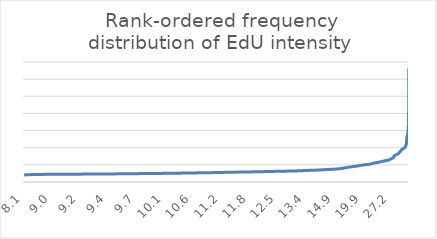
| Category | Series 0 |
|---|---|
| 8.129813264649066 | 8.13 |
| 8.166548042704626 | 8.167 |
| 8.24096025500548 | 8.241 |
| 8.310078627591137 | 8.31 |
| 8.366349866349866 | 8.366 |
| 8.379985111134744 | 8.38 |
| 8.411669367909239 | 8.412 |
| 8.428147100424328 | 8.428 |
| 8.444221260815821 | 8.444 |
| 8.449436536180308 | 8.449 |
| 8.456498129600579 | 8.456 |
| 8.457834495461123 | 8.458 |
| 8.459143968871595 | 8.459 |
| 8.466996699669966 | 8.467 |
| 8.485028790786949 | 8.485 |
| 8.516628134447803 | 8.517 |
| 8.532290279627164 | 8.532 |
| 8.53605959740054 | 8.536 |
| 8.538461538461538 | 8.538 |
| 8.541028604449581 | 8.541 |
| 8.546716003700277 | 8.547 |
| 8.552356020942408 | 8.552 |
| 8.554567022538553 | 8.555 |
| 8.574025974025973 | 8.574 |
| 8.605046343975284 | 8.605 |
| 8.609318377911993 | 8.609 |
| 8.622008032128514 | 8.622 |
| 8.622486390401066 | 8.622 |
| 8.638249224236485 | 8.638 |
| 8.64564237999068 | 8.646 |
| 8.65102207686018 | 8.651 |
| 8.65966921119593 | 8.66 |
| 8.660239866403522 | 8.66 |
| 8.665333983422721 | 8.665 |
| 8.67936657259329 | 8.679 |
| 8.69689886239676 | 8.697 |
| 8.705189430117796 | 8.705 |
| 8.70823872851119 | 8.708 |
| 8.717571059431524 | 8.718 |
| 8.728614249481208 | 8.729 |
| 8.729159500057333 | 8.729 |
| 8.737195221731303 | 8.737 |
| 8.739153162571876 | 8.739 |
| 8.745560561887093 | 8.746 |
| 8.746480434541626 | 8.746 |
| 8.758501594048884 | 8.759 |
| 8.770385710587627 | 8.77 |
| 8.77659574468085 | 8.777 |
| 8.781762168823168 | 8.782 |
| 8.790815370196814 | 8.791 |
| 8.793416884726621 | 8.793 |
| 8.803189257238774 | 8.803 |
| 8.810875576036866 | 8.811 |
| 8.811036789297658 | 8.811 |
| 8.822740231427135 | 8.823 |
| 8.833499005964216 | 8.833 |
| 8.83544833356575 | 8.835 |
| 8.838607927662707 | 8.839 |
| 8.838633871220429 | 8.839 |
| 8.85083821450212 | 8.851 |
| 8.852876911871814 | 8.853 |
| 8.85360962566845 | 8.854 |
| 8.85738743365862 | 8.857 |
| 8.86023113528212 | 8.86 |
| 8.86160312218553 | 8.862 |
| 8.87111334002006 | 8.871 |
| 8.881852230166837 | 8.882 |
| 8.883631499749205 | 8.884 |
| 8.88950276243094 | 8.89 |
| 8.891536132683955 | 8.892 |
| 8.893480257116622 | 8.893 |
| 8.895625 | 8.896 |
| 8.897562066651755 | 8.898 |
| 8.897903372835005 | 8.898 |
| 8.898186173853524 | 8.898 |
| 8.90245985650837 | 8.902 |
| 8.90302432610125 | 8.903 |
| 8.907347379794706 | 8.907 |
| 8.91202823784958 | 8.912 |
| 8.912136294027565 | 8.912 |
| 8.91364639142767 | 8.914 |
| 8.914715968391233 | 8.915 |
| 8.915706175812833 | 8.916 |
| 8.916296625222024 | 8.916 |
| 8.926121853338199 | 8.926 |
| 8.928296296296296 | 8.928 |
| 8.930947897049592 | 8.931 |
| 8.933562992125983 | 8.934 |
| 8.934878587196469 | 8.935 |
| 8.938129942626764 | 8.938 |
| 8.939492074313959 | 8.939 |
| 8.945547445255475 | 8.946 |
| 8.947769817425469 | 8.948 |
| 8.949609035621199 | 8.95 |
| 8.9506854531607 | 8.951 |
| 8.950883449505593 | 8.951 |
| 8.95171875 | 8.952 |
| 8.952815829528157 | 8.953 |
| 8.957718120805369 | 8.958 |
| 8.961833003952568 | 8.962 |
| 8.961864406779661 | 8.962 |
| 8.96410624551328 | 8.964 |
| 8.96595481275147 | 8.966 |
| 8.973562152133582 | 8.974 |
| 8.973927542822494 | 8.974 |
| 8.975416336241079 | 8.975 |
| 8.977755136695533 | 8.978 |
| 8.983205288547436 | 8.983 |
| 8.984319963640495 | 8.984 |
| 8.984738438907787 | 8.985 |
| 8.985842985842986 | 8.986 |
| 8.988038602691315 | 8.988 |
| 8.995953382971836 | 8.996 |
| 8.997592536864278 | 8.998 |
| 8.999272409778813 | 8.999 |
| 9.0 | 9 |
| 9.002621919244888 | 9.003 |
| 9.003443276549474 | 9.003 |
| 9.005114735969036 | 9.005 |
| 9.005430022771064 | 9.005 |
| 9.005480371323118 | 9.005 |
| 9.00611971696309 | 9.006 |
| 9.006280903380997 | 9.006 |
| 9.008108108108107 | 9.008 |
| 9.011228945726762 | 9.011 |
| 9.01596458277435 | 9.016 |
| 9.016216216216216 | 9.016 |
| 9.016454352441613 | 9.016 |
| 9.016587373023016 | 9.017 |
| 9.020104438642297 | 9.02 |
| 9.02998279675596 | 9.03 |
| 9.03375703271515 | 9.034 |
| 9.033913170589095 | 9.034 |
| 9.035043804755945 | 9.035 |
| 9.039358359517117 | 9.039 |
| 9.040196767392832 | 9.04 |
| 9.042739652150464 | 9.043 |
| 9.04526032600095 | 9.045 |
| 9.048567747051244 | 9.049 |
| 9.04915912031048 | 9.049 |
| 9.054108894149476 | 9.054 |
| 9.054842161583734 | 9.055 |
| 9.0635327927743 | 9.064 |
| 9.066113686264943 | 9.066 |
| 9.067302219692658 | 9.067 |
| 9.069659953780125 | 9.07 |
| 9.070823710546573 | 9.071 |
| 9.071221131240492 | 9.071 |
| 9.072883573163894 | 9.073 |
| 9.073660960795142 | 9.074 |
| 9.074028629856851 | 9.074 |
| 9.07514450867052 | 9.075 |
| 9.075195433676635 | 9.075 |
| 9.075357710651828 | 9.075 |
| 9.077960284383428 | 9.078 |
| 9.079102874026322 | 9.079 |
| 9.084044437288682 | 9.084 |
| 9.084459972656843 | 9.084 |
| 9.087212563095905 | 9.087 |
| 9.090793448878996 | 9.091 |
| 9.092301491334139 | 9.092 |
| 9.093959731543624 | 9.094 |
| 9.095511621693829 | 9.096 |
| 9.101149425287357 | 9.101 |
| 9.101897284919856 | 9.102 |
| 9.104249909189974 | 9.104 |
| 9.10529072812991 | 9.105 |
| 9.105847520355292 | 9.106 |
| 9.107936507936508 | 9.108 |
| 9.111025443330764 | 9.111 |
| 9.112668390257177 | 9.113 |
| 9.114404703576678 | 9.114 |
| 9.116996145716772 | 9.117 |
| 9.117428741092636 | 9.117 |
| 9.121766928218541 | 9.122 |
| 9.12647619047619 | 9.126 |
| 9.127337945170382 | 9.127 |
| 9.133295838020247 | 9.133 |
| 9.134433629566935 | 9.134 |
| 9.136840481332921 | 9.137 |
| 9.138026113048415 | 9.138 |
| 9.13826146475017 | 9.138 |
| 9.138374717832956 | 9.138 |
| 9.143751957406828 | 9.144 |
| 9.144792815503388 | 9.145 |
| 9.144966204197795 | 9.145 |
| 9.14546965918537 | 9.145 |
| 9.146328220442514 | 9.146 |
| 9.148375768217734 | 9.148 |
| 9.149300857013984 | 9.149 |
| 9.149408500073024 | 9.149 |
| 9.150312221231044 | 9.15 |
| 9.152042160737812 | 9.152 |
| 9.15343237704918 | 9.153 |
| 9.15435096469353 | 9.154 |
| 9.154432793136321 | 9.154 |
| 9.156919673717683 | 9.157 |
| 9.157017432243288 | 9.157 |
| 9.163534513913985 | 9.164 |
| 9.166761202495746 | 9.167 |
| 9.169150221506243 | 9.169 |
| 9.174244524535625 | 9.174 |
| 9.177725118483412 | 9.178 |
| 9.179417369997278 | 9.179 |
| 9.183983431135658 | 9.184 |
| 9.186450943069735 | 9.186 |
| 9.18687676966638 | 9.187 |
| 9.192562735665064 | 9.193 |
| 9.194591611479028 | 9.195 |
| 9.194776589049717 | 9.195 |
| 9.200248928225696 | 9.2 |
| 9.200872919204222 | 9.201 |
| 9.201003497035122 | 9.201 |
| 9.201331114808653 | 9.201 |
| 9.20253164556962 | 9.203 |
| 9.2054179145113 | 9.205 |
| 9.20751916893396 | 9.208 |
| 9.216013219167793 | 9.216 |
| 9.219592831042283 | 9.22 |
| 9.222958057395143 | 9.223 |
| 9.225694444444445 | 9.226 |
| 9.228482446206115 | 9.228 |
| 9.228517666736359 | 9.229 |
| 9.232904788522452 | 9.233 |
| 9.235556381200075 | 9.236 |
| 9.237775202780997 | 9.238 |
| 9.240120436582613 | 9.24 |
| 9.24077407740774 | 9.241 |
| 9.243337195828506 | 9.243 |
| 9.245876834619459 | 9.246 |
| 9.249405548216645 | 9.249 |
| 9.25161923454367 | 9.252 |
| 9.258383407637139 | 9.258 |
| 9.258628841607566 | 9.259 |
| 9.260070790493849 | 9.26 |
| 9.260876132930514 | 9.261 |
| 9.262137617883338 | 9.262 |
| 9.26259798432251 | 9.263 |
| 9.263687699484409 | 9.264 |
| 9.264243845252052 | 9.264 |
| 9.265185421994884 | 9.265 |
| 9.266123670212766 | 9.266 |
| 9.266146770645872 | 9.266 |
| 9.270485526114259 | 9.27 |
| 9.273116031549938 | 9.273 |
| 9.276154001209434 | 9.276 |
| 9.279123911356386 | 9.279 |
| 9.282118769534463 | 9.282 |
| 9.282602118003025 | 9.283 |
| 9.284162086156206 | 9.284 |
| 9.286654135338345 | 9.287 |
| 9.291518537328594 | 9.292 |
| 9.292140575079872 | 9.292 |
| 9.29462970403107 | 9.295 |
| 9.297084580423457 | 9.297 |
| 9.297407698350353 | 9.297 |
| 9.301999205613663 | 9.302 |
| 9.30224309815951 | 9.302 |
| 9.302430751837196 | 9.302 |
| 9.305858483388283 | 9.306 |
| 9.308482896149716 | 9.308 |
| 9.310172497178785 | 9.31 |
| 9.310265077388365 | 9.31 |
| 9.310720475365189 | 9.311 |
| 9.312926391382407 | 9.313 |
| 9.318096796820202 | 9.318 |
| 9.320267068705578 | 9.32 |
| 9.321200510855684 | 9.321 |
| 9.32411067193676 | 9.324 |
| 9.324805699481866 | 9.325 |
| 9.326155545038649 | 9.326 |
| 9.326539462272333 | 9.327 |
| 9.330219187926698 | 9.33 |
| 9.333522969705589 | 9.334 |
| 9.33442862358525 | 9.334 |
| 9.340546187136248 | 9.341 |
| 9.342038035764974 | 9.342 |
| 9.345134965473948 | 9.345 |
| 9.346321800470273 | 9.346 |
| 9.347252448313384 | 9.347 |
| 9.347332850591359 | 9.347 |
| 9.348613469156764 | 9.349 |
| 9.348701955495617 | 9.349 |
| 9.350625459896984 | 9.351 |
| 9.355636473979668 | 9.356 |
| 9.356299026557036 | 9.356 |
| 9.359747204666991 | 9.36 |
| 9.363109297831222 | 9.363 |
| 9.363664741688778 | 9.364 |
| 9.366116751269036 | 9.366 |
| 9.367935752528258 | 9.368 |
| 9.372543741588157 | 9.373 |
| 9.374017222014228 | 9.374 |
| 9.374838848302536 | 9.375 |
| 9.378120940972723 | 9.378 |
| 9.378188626257899 | 9.378 |
| 9.389293296936609 | 9.389 |
| 9.392830949761644 | 9.393 |
| 9.394549361076558 | 9.395 |
| 9.396082474226803 | 9.396 |
| 9.40054262458946 | 9.401 |
| 9.404520060944641 | 9.405 |
| 9.407932011331445 | 9.408 |
| 9.409451046972269 | 9.409 |
| 9.409602784602784 | 9.41 |
| 9.411795083660401 | 9.412 |
| 9.417451708059758 | 9.417 |
| 9.417689015691868 | 9.418 |
| 9.42214964940928 | 9.422 |
| 9.424568965517242 | 9.425 |
| 9.42521887159533 | 9.425 |
| 9.426535836177475 | 9.427 |
| 9.43687099725526 | 9.437 |
| 9.441597842575426 | 9.442 |
| 9.441622691292876 | 9.442 |
| 9.442042358730996 | 9.442 |
| 9.44228356336261 | 9.442 |
| 9.449574726609963 | 9.45 |
| 9.451551914290215 | 9.452 |
| 9.467504598405887 | 9.468 |
| 9.468667979002625 | 9.469 |
| 9.47001828153565 | 9.47 |
| 9.471065356418656 | 9.471 |
| 9.472277556440902 | 9.472 |
| 9.473381507152338 | 9.473 |
| 9.474570366929866 | 9.475 |
| 9.476833685481436 | 9.477 |
| 9.479568129014623 | 9.48 |
| 9.480049109883364 | 9.48 |
| 9.4885020137716 | 9.489 |
| 9.489320007838526 | 9.489 |
| 9.489695111565322 | 9.49 |
| 9.489720925613268 | 9.49 |
| 9.50189489641233 | 9.502 |
| 9.508739650413984 | 9.509 |
| 9.511719560257209 | 9.512 |
| 9.512962962962963 | 9.513 |
| 9.517188926072407 | 9.517 |
| 9.524772497472194 | 9.525 |
| 9.524918300653594 | 9.525 |
| 9.528756398675098 | 9.529 |
| 9.530456852791879 | 9.53 |
| 9.532325338894681 | 9.532 |
| 9.534167732505024 | 9.534 |
| 9.536882267441861 | 9.537 |
| 9.540552016985139 | 9.541 |
| 9.542437102152167 | 9.542 |
| 9.542521464075914 | 9.543 |
| 9.544990176817288 | 9.545 |
| 9.546531020680453 | 9.547 |
| 9.548562300319489 | 9.549 |
| 9.549616911289577 | 9.55 |
| 9.55013039698638 | 9.55 |
| 9.55889819751206 | 9.559 |
| 9.5592 | 9.559 |
| 9.562273507533854 | 9.562 |
| 9.563716364867151 | 9.564 |
| 9.568313306631063 | 9.568 |
| 9.574105212587076 | 9.574 |
| 9.591045335331584 | 9.591 |
| 9.593191122602887 | 9.593 |
| 9.5946123521682 | 9.595 |
| 9.596833333333333 | 9.597 |
| 9.604242424242424 | 9.604 |
| 9.608348457350273 | 9.608 |
| 9.611764705882353 | 9.612 |
| 9.615876288659793 | 9.616 |
| 9.618676677616143 | 9.619 |
| 9.621877110060769 | 9.622 |
| 9.628935352078827 | 9.629 |
| 9.630619971604354 | 9.631 |
| 9.631627734519837 | 9.632 |
| 9.633740288568257 | 9.634 |
| 9.643312101910828 | 9.643 |
| 9.645459488852637 | 9.645 |
| 9.65024818633066 | 9.65 |
| 9.650421226675064 | 9.65 |
| 9.653272101033295 | 9.653 |
| 9.653675819309123 | 9.654 |
| 9.656023222060957 | 9.656 |
| 9.663365011377326 | 9.663 |
| 9.66530666845027 | 9.665 |
| 9.669206858517999 | 9.669 |
| 9.669419050427603 | 9.669 |
| 9.676804175449162 | 9.677 |
| 9.677480614021206 | 9.677 |
| 9.689069634703197 | 9.689 |
| 9.697108066971081 | 9.697 |
| 9.700319415925165 | 9.7 |
| 9.700406353897304 | 9.7 |
| 9.703338034790786 | 9.703 |
| 9.710396851426697 | 9.71 |
| 9.711867395521072 | 9.712 |
| 9.715211970074813 | 9.715 |
| 9.71584699453552 | 9.716 |
| 9.716895874263262 | 9.717 |
| 9.723561499208165 | 9.724 |
| 9.732248745628706 | 9.732 |
| 9.733291219204043 | 9.733 |
| 9.735183673469388 | 9.735 |
| 9.736507936507936 | 9.737 |
| 9.736829268292682 | 9.737 |
| 9.745309135650569 | 9.745 |
| 9.746854554604932 | 9.747 |
| 9.74827362969357 | 9.748 |
| 9.753965026433509 | 9.754 |
| 9.765575146935348 | 9.766 |
| 9.76589121887287 | 9.766 |
| 9.769949569860575 | 9.77 |
| 9.772648648648648 | 9.773 |
| 9.773772321428572 | 9.774 |
| 9.777430817271455 | 9.777 |
| 9.777570093457944 | 9.778 |
| 9.788723160137682 | 9.789 |
| 9.795962902345881 | 9.796 |
| 9.799827882960413 | 9.8 |
| 9.800762631077216 | 9.801 |
| 9.812161844271936 | 9.812 |
| 9.822685788787483 | 9.823 |
| 9.826243413443002 | 9.826 |
| 9.82836220753706 | 9.828 |
| 9.829828987945051 | 9.83 |
| 9.829894471570325 | 9.83 |
| 9.829964664310953 | 9.83 |
| 9.831172491544532 | 9.831 |
| 9.838375190258752 | 9.838 |
| 9.840905853866971 | 9.841 |
| 9.846178293341808 | 9.846 |
| 9.846300533943555 | 9.846 |
| 9.847964499324716 | 9.848 |
| 9.85006518904824 | 9.85 |
| 9.852730696798494 | 9.853 |
| 9.855372978612415 | 9.855 |
| 9.856559949780289 | 9.857 |
| 9.859822150363783 | 9.86 |
| 9.861405769802717 | 9.861 |
| 9.865581888928192 | 9.866 |
| 9.866205305651672 | 9.866 |
| 9.867099918765232 | 9.867 |
| 9.869024996345564 | 9.869 |
| 9.873450413223141 | 9.873 |
| 9.877233165368759 | 9.877 |
| 9.877946127946128 | 9.878 |
| 9.878380311918729 | 9.878 |
| 9.878562945368172 | 9.879 |
| 9.879839298758217 | 9.88 |
| 9.885803033071442 | 9.886 |
| 9.887935544626975 | 9.888 |
| 9.89237106017192 | 9.892 |
| 9.903861671469741 | 9.904 |
| 9.906614173228347 | 9.907 |
| 9.907809983896941 | 9.908 |
| 9.908300294155262 | 9.908 |
| 9.911038209185643 | 9.911 |
| 9.911246200607902 | 9.911 |
| 9.911774352246638 | 9.912 |
| 9.918669486637185 | 9.919 |
| 9.924189872163314 | 9.924 |
| 9.925690021231423 | 9.926 |
| 9.930005546311703 | 9.93 |
| 9.935530780416869 | 9.936 |
| 9.939168927602456 | 9.939 |
| 9.945148881607066 | 9.945 |
| 9.956773091577979 | 9.957 |
| 9.958744788237876 | 9.959 |
| 9.961666487705358 | 9.962 |
| 9.969537652698314 | 9.97 |
| 9.97764853461056 | 9.978 |
| 9.977826019537913 | 9.978 |
| 9.979940808944427 | 9.98 |
| 9.983585392843969 | 9.984 |
| 9.98953728264073 | 9.99 |
| 9.989729059677705 | 9.99 |
| 9.991497975708501 | 9.991 |
| 9.996378998189499 | 9.996 |
| 9.997916666666667 | 9.998 |
| 9.99946647696959 | 9.999 |
| 10.007346393588602 | 10.007 |
| 10.00835348428226 | 10.008 |
| 10.013635855594053 | 10.014 |
| 10.017462837350267 | 10.017 |
| 10.02375130981488 | 10.024 |
| 10.025593220338983 | 10.026 |
| 10.029856768206576 | 10.03 |
| 10.03476933514247 | 10.035 |
| 10.038669844020797 | 10.039 |
| 10.04137303932712 | 10.041 |
| 10.043322789162426 | 10.043 |
| 10.04772937905468 | 10.048 |
| 10.05309381237525 | 10.053 |
| 10.074551569506726 | 10.075 |
| 10.076935056844729 | 10.077 |
| 10.077174235678243 | 10.077 |
| 10.08748701973001 | 10.087 |
| 10.092386397833284 | 10.092 |
| 10.092405961674947 | 10.092 |
| 10.095147478591818 | 10.095 |
| 10.110973533508744 | 10.111 |
| 10.11111111111111 | 10.111 |
| 10.111539697846352 | 10.112 |
| 10.111798497569598 | 10.112 |
| 10.11457511181268 | 10.115 |
| 10.114949374627754 | 10.115 |
| 10.122879709957271 | 10.123 |
| 10.12528604118993 | 10.125 |
| 10.137403786145205 | 10.137 |
| 10.142188122758071 | 10.142 |
| 10.148693093301022 | 10.149 |
| 10.152166496076424 | 10.152 |
| 10.163917391869074 | 10.164 |
| 10.167696744952616 | 10.168 |
| 10.168693812797462 | 10.169 |
| 10.170228022372006 | 10.17 |
| 10.175293894577171 | 10.175 |
| 10.17909629304672 | 10.179 |
| 10.183391486392184 | 10.183 |
| 10.185685419546953 | 10.186 |
| 10.201946771808773 | 10.202 |
| 10.208390963577685 | 10.208 |
| 10.211145194274028 | 10.211 |
| 10.219809439397297 | 10.22 |
| 10.224065362713542 | 10.224 |
| 10.224270776004403 | 10.224 |
| 10.226871145190865 | 10.227 |
| 10.248396750748183 | 10.248 |
| 10.248578391551584 | 10.249 |
| 10.252049537763824 | 10.252 |
| 10.25390770375884 | 10.254 |
| 10.25420898845137 | 10.254 |
| 10.260656740770957 | 10.261 |
| 10.26898893360161 | 10.269 |
| 10.269207223752678 | 10.269 |
| 10.269348127600555 | 10.269 |
| 10.27552967165378 | 10.276 |
| 10.283709579011592 | 10.284 |
| 10.286691365061271 | 10.287 |
| 10.290101870153565 | 10.29 |
| 10.293023677764674 | 10.293 |
| 10.293819104585825 | 10.294 |
| 10.295857388838245 | 10.296 |
| 10.296053897978826 | 10.296 |
| 10.296326530612244 | 10.296 |
| 10.296487455197132 | 10.296 |
| 10.302398331595413 | 10.302 |
| 10.30329312915029 | 10.303 |
| 10.30690537084399 | 10.307 |
| 10.307737141191899 | 10.308 |
| 10.316396396396396 | 10.316 |
| 10.318437719915552 | 10.318 |
| 10.318534616578702 | 10.319 |
| 10.32606344628695 | 10.326 |
| 10.32817949314113 | 10.328 |
| 10.333258578156537 | 10.333 |
| 10.337484116899619 | 10.337 |
| 10.346452067669173 | 10.346 |
| 10.34822259445375 | 10.348 |
| 10.358203972625605 | 10.358 |
| 10.364639142767098 | 10.365 |
| 10.36923076923077 | 10.369 |
| 10.373532982598139 | 10.374 |
| 10.38216650232427 | 10.382 |
| 10.382913165266107 | 10.383 |
| 10.392980721700445 | 10.393 |
| 10.397667359003036 | 10.398 |
| 10.40019491450341 | 10.4 |
| 10.402755993726194 | 10.403 |
| 10.406634068983745 | 10.407 |
| 10.408529438283292 | 10.409 |
| 10.41062941091747 | 10.411 |
| 10.413468869123253 | 10.413 |
| 10.419656392117231 | 10.42 |
| 10.419745154727487 | 10.42 |
| 10.422066094197241 | 10.422 |
| 10.427735610373182 | 10.428 |
| 10.430176719170188 | 10.43 |
| 10.43042537851478 | 10.43 |
| 10.442817216321968 | 10.443 |
| 10.457882661422484 | 10.458 |
| 10.477155727155727 | 10.477 |
| 10.479894644424935 | 10.48 |
| 10.486517719568567 | 10.487 |
| 10.487238340066103 | 10.487 |
| 10.488027124390761 | 10.488 |
| 10.489474459001913 | 10.489 |
| 10.498901903367496 | 10.499 |
| 10.509636803874091 | 10.51 |
| 10.509711779448622 | 10.51 |
| 10.515821708063967 | 10.516 |
| 10.51825959933222 | 10.518 |
| 10.519910799617712 | 10.52 |
| 10.536699941280094 | 10.537 |
| 10.540870403083346 | 10.541 |
| 10.543561819346573 | 10.544 |
| 10.561264822134387 | 10.561 |
| 10.568909090909091 | 10.569 |
| 10.570941487021557 | 10.571 |
| 10.571003360537686 | 10.571 |
| 10.576720310765817 | 10.577 |
| 10.586291739894552 | 10.586 |
| 10.594398635200456 | 10.594 |
| 10.598557182261828 | 10.599 |
| 10.599688230709274 | 10.6 |
| 10.604140474394434 | 10.604 |
| 10.608494533221194 | 10.608 |
| 10.609152288072018 | 10.609 |
| 10.60948905109489 | 10.609 |
| 10.620674551029348 | 10.621 |
| 10.631323350870094 | 10.631 |
| 10.636032879665812 | 10.636 |
| 10.636951034830894 | 10.637 |
| 10.639126801754752 | 10.639 |
| 10.64093567251462 | 10.641 |
| 10.643370673800367 | 10.643 |
| 10.647576016607644 | 10.648 |
| 10.657178388835153 | 10.657 |
| 10.658766377152952 | 10.659 |
| 10.662840136054422 | 10.663 |
| 10.663383749560323 | 10.663 |
| 10.668723532970358 | 10.669 |
| 10.67960489705064 | 10.68 |
| 10.681813711025868 | 10.682 |
| 10.684623138089371 | 10.685 |
| 10.697141385526654 | 10.697 |
| 10.700084423807514 | 10.7 |
| 10.7015577231038 | 10.702 |
| 10.704181028023378 | 10.704 |
| 10.706192358366271 | 10.706 |
| 10.709082308420056 | 10.709 |
| 10.713730692694021 | 10.714 |
| 10.713763145861911 | 10.714 |
| 10.714285714285714 | 10.714 |
| 10.717302704705446 | 10.717 |
| 10.722995594713657 | 10.723 |
| 10.72569626904887 | 10.726 |
| 10.735527809307605 | 10.736 |
| 10.737598467106665 | 10.738 |
| 10.75482121333869 | 10.755 |
| 10.758341128780792 | 10.758 |
| 10.758752083829483 | 10.759 |
| 10.769027384324835 | 10.769 |
| 10.776010751483929 | 10.776 |
| 10.781665132184663 | 10.782 |
| 10.786506469500925 | 10.787 |
| 10.786780383795309 | 10.787 |
| 10.803071017274473 | 10.803 |
| 10.81484671029969 | 10.815 |
| 10.819385420071919 | 10.819 |
| 10.825197889182059 | 10.825 |
| 10.828816621499548 | 10.829 |
| 10.837810023669856 | 10.838 |
| 10.839458826036008 | 10.839 |
| 10.850613154960982 | 10.851 |
| 10.852430173740927 | 10.852 |
| 10.855655984661736 | 10.856 |
| 10.855833842394624 | 10.856 |
| 10.873244929797192 | 10.873 |
| 10.881022010158535 | 10.881 |
| 10.882507976140936 | 10.883 |
| 10.892305107526882 | 10.892 |
| 10.906096316229005 | 10.906 |
| 10.906703190460844 | 10.907 |
| 10.909159871041153 | 10.909 |
| 10.909306156063414 | 10.909 |
| 10.92032555150996 | 10.92 |
| 10.921223573875045 | 10.921 |
| 10.922049801515698 | 10.922 |
| 10.927391838405896 | 10.927 |
| 10.92824427480916 | 10.928 |
| 10.93621507643648 | 10.936 |
| 10.936349693251534 | 10.936 |
| 10.942335589941973 | 10.942 |
| 10.94934725848564 | 10.949 |
| 10.963765963765963 | 10.964 |
| 10.965165097015772 | 10.965 |
| 10.96570053154147 | 10.966 |
| 10.971078475538336 | 10.971 |
| 10.97338157384675 | 10.973 |
| 10.974687652117476 | 10.975 |
| 10.975864202988241 | 10.976 |
| 10.984014826827291 | 10.984 |
| 10.984222691186815 | 10.984 |
| 10.9971031985516 | 10.997 |
| 10.997507215953817 | 10.998 |
| 11.008542141230068 | 11.009 |
| 11.017396679618509 | 11.017 |
| 11.048318332543818 | 11.048 |
| 11.055055055055055 | 11.055 |
| 11.062809174036875 | 11.063 |
| 11.082827561585148 | 11.083 |
| 11.103651354534747 | 11.104 |
| 11.109432191459408 | 11.109 |
| 11.109647561409755 | 11.11 |
| 11.120291465975052 | 11.12 |
| 11.129897132851827 | 11.13 |
| 11.13229357798165 | 11.132 |
| 11.136386855099609 | 11.136 |
| 11.144604458473072 | 11.145 |
| 11.144744466334453 | 11.145 |
| 11.161682644155102 | 11.162 |
| 11.162200785994997 | 11.162 |
| 11.16305220883534 | 11.163 |
| 11.17756081416515 | 11.178 |
| 11.17795080117355 | 11.178 |
| 11.190859549170176 | 11.191 |
| 11.190953857377348 | 11.191 |
| 11.205235411743319 | 11.205 |
| 11.208762886597938 | 11.209 |
| 11.214118915035028 | 11.214 |
| 11.219042316258351 | 11.219 |
| 11.222960151802656 | 11.223 |
| 11.224316939890711 | 11.224 |
| 11.232628704359259 | 11.233 |
| 11.235147867050511 | 11.235 |
| 11.236160349059176 | 11.236 |
| 11.238248847926267 | 11.238 |
| 11.240270727580372 | 11.24 |
| 11.240743494423791 | 11.241 |
| 11.249583256158548 | 11.25 |
| 11.251958392192115 | 11.252 |
| 11.254649217750664 | 11.255 |
| 11.256267010456954 | 11.256 |
| 11.259164733178654 | 11.259 |
| 11.264674284598104 | 11.265 |
| 11.264891488379252 | 11.265 |
| 11.290001319087192 | 11.29 |
| 11.298443147067001 | 11.298 |
| 11.325251330573625 | 11.325 |
| 11.348573213913768 | 11.349 |
| 11.354115586690018 | 11.354 |
| 11.358966775115844 | 11.359 |
| 11.35946080878682 | 11.359 |
| 11.373696872493985 | 11.374 |
| 11.3801775147929 | 11.38 |
| 11.386416408668731 | 11.386 |
| 11.388896163414953 | 11.389 |
| 11.391650099403579 | 11.392 |
| 11.39380013368984 | 11.394 |
| 11.401687454145268 | 11.402 |
| 11.406215987422906 | 11.406 |
| 11.411910056832221 | 11.412 |
| 11.413460447168312 | 11.413 |
| 11.421039725355566 | 11.421 |
| 11.424720390020074 | 11.425 |
| 11.441115814609791 | 11.441 |
| 11.442481250794458 | 11.442 |
| 11.452282157676349 | 11.452 |
| 11.457281112959322 | 11.457 |
| 11.46154977209234 | 11.462 |
| 11.46593023255814 | 11.466 |
| 11.479472954230236 | 11.479 |
| 11.485376200044653 | 11.485 |
| 11.489909468125235 | 11.49 |
| 11.502918403811792 | 11.503 |
| 11.504462691895752 | 11.504 |
| 11.506257822277847 | 11.506 |
| 11.50740883906713 | 11.507 |
| 11.516760904684975 | 11.517 |
| 11.528232800154171 | 11.528 |
| 11.529664226205504 | 11.53 |
| 11.536042162529752 | 11.536 |
| 11.540663900414938 | 11.541 |
| 11.541723049165538 | 11.542 |
| 11.546952224052719 | 11.547 |
| 11.549672213817448 | 11.55 |
| 11.559921617161717 | 11.56 |
| 11.560856158171594 | 11.561 |
| 11.562011173184358 | 11.562 |
| 11.566823704438383 | 11.567 |
| 11.56813170660003 | 11.568 |
| 11.568405139833711 | 11.568 |
| 11.57462019660411 | 11.575 |
| 11.581401690755387 | 11.581 |
| 11.586712261846605 | 11.587 |
| 11.605756358768406 | 11.606 |
| 11.623615892807296 | 11.624 |
| 11.625722209382944 | 11.626 |
| 11.639897435897437 | 11.64 |
| 11.644350758853289 | 11.644 |
| 11.649072753209701 | 11.649 |
| 11.65302610192179 | 11.653 |
| 11.661697596592637 | 11.662 |
| 11.664547818549552 | 11.665 |
| 11.665197188132968 | 11.665 |
| 11.668964796824403 | 11.669 |
| 11.699083598279408 | 11.699 |
| 11.700439355611769 | 11.7 |
| 11.71557418699187 | 11.716 |
| 11.71715774917562 | 11.717 |
| 11.728670691422714 | 11.729 |
| 11.728798455369077 | 11.729 |
| 11.732288677996028 | 11.732 |
| 11.732826843937955 | 11.733 |
| 11.734957020057307 | 11.735 |
| 11.735781056425273 | 11.736 |
| 11.7425035697287 | 11.743 |
| 11.747025419145483 | 11.747 |
| 11.748947684906796 | 11.749 |
| 11.754054369385136 | 11.754 |
| 11.76080340839927 | 11.761 |
| 11.76158495634654 | 11.762 |
| 11.766516058126756 | 11.767 |
| 11.772487804878049 | 11.772 |
| 11.775092637344933 | 11.775 |
| 11.794421487603305 | 11.794 |
| 11.797289853475817 | 11.797 |
| 11.798793395427603 | 11.799 |
| 11.801600817438691 | 11.802 |
| 11.803163241745555 | 11.803 |
| 11.807880237030876 | 11.808 |
| 11.820245120290513 | 11.82 |
| 11.82343725520915 | 11.823 |
| 11.83358598618831 | 11.834 |
| 11.842247433819557 | 11.842 |
| 11.85795583883451 | 11.858 |
| 11.861761638380582 | 11.862 |
| 11.866372980910425 | 11.866 |
| 11.8719723183391 | 11.872 |
| 11.898393724318266 | 11.898 |
| 11.917422044960116 | 11.917 |
| 11.92612195390892 | 11.926 |
| 11.92841775865441 | 11.928 |
| 11.932386910490857 | 11.932 |
| 11.962884908090388 | 11.963 |
| 11.979299918595185 | 11.979 |
| 11.984516817939134 | 11.985 |
| 11.990448901623687 | 11.99 |
| 11.992000820428673 | 11.992 |
| 11.998112732762959 | 11.998 |
| 11.999137838129109 | 11.999 |
| 12.011296611016695 | 12.011 |
| 12.013800820589333 | 12.014 |
| 12.028936432199476 | 12.029 |
| 12.037859154929578 | 12.038 |
| 12.040688092295014 | 12.041 |
| 12.042569081404032 | 12.043 |
| 12.047845659163988 | 12.048 |
| 12.050682961897914 | 12.051 |
| 12.059643593162807 | 12.06 |
| 12.064458900059137 | 12.064 |
| 12.066504213625748 | 12.067 |
| 12.067961165048544 | 12.068 |
| 12.06945889698231 | 12.069 |
| 12.078757133798351 | 12.079 |
| 12.094577553593947 | 12.095 |
| 12.095567144719688 | 12.096 |
| 12.097908224728945 | 12.098 |
| 12.098446147296722 | 12.098 |
| 12.099941724941726 | 12.1 |
| 12.103866565579985 | 12.104 |
| 12.10675818373812 | 12.107 |
| 12.108792522551896 | 12.109 |
| 12.109224057338734 | 12.109 |
| 12.112628561793963 | 12.113 |
| 12.12288013797068 | 12.123 |
| 12.129849449913145 | 12.13 |
| 12.130851792646723 | 12.131 |
| 12.137264806162394 | 12.137 |
| 12.14954982450786 | 12.15 |
| 12.156912826207662 | 12.157 |
| 12.165755014089177 | 12.166 |
| 12.176235268677695 | 12.176 |
| 12.189796850034238 | 12.19 |
| 12.19119170984456 | 12.191 |
| 12.202673410404625 | 12.203 |
| 12.207046388725779 | 12.207 |
| 12.207352287872057 | 12.207 |
| 12.212889117571391 | 12.213 |
| 12.228043979910412 | 12.228 |
| 12.24042361424065 | 12.24 |
| 12.258354755784062 | 12.258 |
| 12.277682233099616 | 12.278 |
| 12.28031007751938 | 12.28 |
| 12.288595594386095 | 12.289 |
| 12.28917329643722 | 12.289 |
| 12.293124929210556 | 12.293 |
| 12.296020161713745 | 12.296 |
| 12.298811846071999 | 12.299 |
| 12.310368256556597 | 12.31 |
| 12.31520609629373 | 12.315 |
| 12.317790167257982 | 12.318 |
| 12.330810171496156 | 12.331 |
| 12.331011211494504 | 12.331 |
| 12.346009085009735 | 12.346 |
| 12.348693966008897 | 12.349 |
| 12.350948834974778 | 12.351 |
| 12.360917343526038 | 12.361 |
| 12.3764689423615 | 12.376 |
| 12.393113159242192 | 12.393 |
| 12.396814335490294 | 12.397 |
| 12.402930402930403 | 12.403 |
| 12.412197815682905 | 12.412 |
| 12.412546517809675 | 12.413 |
| 12.414831824935836 | 12.415 |
| 12.42614579343802 | 12.426 |
| 12.42726005112712 | 12.427 |
| 12.434039087947882 | 12.434 |
| 12.435146923783288 | 12.435 |
| 12.443528894748408 | 12.444 |
| 12.454867256637169 | 12.455 |
| 12.457622739018088 | 12.458 |
| 12.467897679146198 | 12.468 |
| 12.470735422106179 | 12.471 |
| 12.483462436985123 | 12.483 |
| 12.48717564121794 | 12.487 |
| 12.488031511968488 | 12.488 |
| 12.499263894000736 | 12.499 |
| 12.510450048766895 | 12.51 |
| 12.515235457063712 | 12.515 |
| 12.515927395119606 | 12.516 |
| 12.521663019693655 | 12.522 |
| 12.52180910993079 | 12.522 |
| 12.538283955367449 | 12.538 |
| 12.54444618028433 | 12.544 |
| 12.546570942754581 | 12.547 |
| 12.556037991858888 | 12.556 |
| 12.561258518196317 | 12.561 |
| 12.56586213949683 | 12.566 |
| 12.581534772182254 | 12.582 |
| 12.586397567044513 | 12.586 |
| 12.587660290098801 | 12.588 |
| 12.603562421185371 | 12.604 |
| 12.61955835962145 | 12.62 |
| 12.628796154686476 | 12.629 |
| 12.629612330686594 | 12.63 |
| 12.629818413507486 | 12.63 |
| 12.633149892733886 | 12.633 |
| 12.64756019603665 | 12.648 |
| 12.659065155807365 | 12.659 |
| 12.666258607498087 | 12.666 |
| 12.680024360535931 | 12.68 |
| 12.680350877192982 | 12.68 |
| 12.709666080843585 | 12.71 |
| 12.718402924223254 | 12.718 |
| 12.722308088614117 | 12.722 |
| 12.72375572844506 | 12.724 |
| 12.725206062217495 | 12.725 |
| 12.756865807627229 | 12.757 |
| 12.764194139194139 | 12.764 |
| 12.766895368782162 | 12.767 |
| 12.768580060422961 | 12.769 |
| 12.782878962791937 | 12.783 |
| 12.789182692307692 | 12.789 |
| 12.796760087457763 | 12.797 |
| 12.800569063631661 | 12.801 |
| 12.801242236024844 | 12.801 |
| 12.808613138686132 | 12.809 |
| 12.823384152888126 | 12.823 |
| 12.823390797469925 | 12.823 |
| 12.855642504118617 | 12.856 |
| 12.869032321834537 | 12.869 |
| 12.88052305574673 | 12.881 |
| 12.89138070791678 | 12.891 |
| 12.893054277828886 | 12.893 |
| 12.894344916900497 | 12.894 |
| 12.92529296875 | 12.925 |
| 12.933014811275681 | 12.933 |
| 12.935005521375611 | 12.935 |
| 12.9379970544919 | 12.938 |
| 12.93899350291818 | 12.939 |
| 12.940675387891694 | 12.941 |
| 12.946090335114134 | 12.946 |
| 12.947877615189261 | 12.948 |
| 12.94938256510576 | 12.949 |
| 12.96224512659646 | 12.962 |
| 12.964912280701755 | 12.965 |
| 12.973480372850203 | 12.973 |
| 12.977703312282511 | 12.978 |
| 12.987742009393974 | 12.988 |
| 12.993409642733264 | 12.993 |
| 12.994315432994679 | 12.994 |
| 13.002364066193854 | 13.002 |
| 13.008248102936324 | 13.008 |
| 13.009518935516889 | 13.01 |
| 13.048038008094316 | 13.048 |
| 13.061290322580644 | 13.061 |
| 13.088377723970945 | 13.088 |
| 13.131617493199414 | 13.132 |
| 13.136035186930568 | 13.136 |
| 13.141285151473985 | 13.141 |
| 13.149865096884964 | 13.15 |
| 13.173059668012561 | 13.173 |
| 13.18854271356784 | 13.189 |
| 13.200291805139013 | 13.2 |
| 13.203004622496147 | 13.203 |
| 13.229554828616129 | 13.23 |
| 13.247971360381861 | 13.248 |
| 13.271988328470195 | 13.272 |
| 13.291772435418844 | 13.292 |
| 13.30371485943775 | 13.304 |
| 13.304583835946923 | 13.305 |
| 13.32000583685977 | 13.32 |
| 13.32352403582526 | 13.324 |
| 13.326464772609013 | 13.326 |
| 13.32654986522911 | 13.327 |
| 13.327413032827046 | 13.327 |
| 13.342573753814852 | 13.343 |
| 13.355509099852435 | 13.356 |
| 13.358142962417096 | 13.358 |
| 13.358244365361804 | 13.358 |
| 13.37007658643326 | 13.37 |
| 13.41071191833488 | 13.411 |
| 13.43529276429311 | 13.435 |
| 13.438423645320198 | 13.438 |
| 13.438602220770738 | 13.439 |
| 13.444631901840491 | 13.445 |
| 13.471960661226198 | 13.472 |
| 13.523355704697986 | 13.523 |
| 13.528864293799522 | 13.529 |
| 13.553706505295008 | 13.554 |
| 13.559217185918344 | 13.559 |
| 13.56595568440671 | 13.566 |
| 13.57527553687081 | 13.575 |
| 13.58586316266425 | 13.586 |
| 13.604714675866035 | 13.605 |
| 13.616617851086788 | 13.617 |
| 13.631632137443153 | 13.632 |
| 13.655526315789473 | 13.656 |
| 13.66565349544073 | 13.666 |
| 13.670658024826981 | 13.671 |
| 13.677973767526007 | 13.678 |
| 13.696077400357556 | 13.696 |
| 13.708685366677932 | 13.709 |
| 13.737071815897368 | 13.737 |
| 13.744066552483485 | 13.744 |
| 13.747077876355442 | 13.747 |
| 13.751227998362669 | 13.751 |
| 13.770107595610952 | 13.77 |
| 13.790611423121755 | 13.791 |
| 13.792828685258964 | 13.793 |
| 13.80089485458613 | 13.801 |
| 13.824043591781132 | 13.824 |
| 13.82600745995758 | 13.826 |
| 13.836765018042879 | 13.837 |
| 13.837759380711752 | 13.838 |
| 13.848979050649696 | 13.849 |
| 13.880475872804091 | 13.88 |
| 13.890595463137997 | 13.891 |
| 13.900368356428697 | 13.9 |
| 13.912179924058027 | 13.912 |
| 13.914898805169472 | 13.915 |
| 13.917575757575758 | 13.918 |
| 13.933232346772314 | 13.933 |
| 13.966347899770003 | 13.966 |
| 13.985072582854013 | 13.985 |
| 13.987705363942988 | 13.988 |
| 13.999295179024529 | 13.999 |
| 14.00310045473336 | 14.003 |
| 14.053775424909446 | 14.054 |
| 14.055253426147488 | 14.055 |
| 14.076465820048636 | 14.076 |
| 14.108952826055207 | 14.109 |
| 14.113027078000808 | 14.113 |
| 14.139911634756995 | 14.14 |
| 14.157068694917301 | 14.157 |
| 14.164818237831177 | 14.165 |
| 14.174529756398396 | 14.175 |
| 14.204613992762365 | 14.205 |
| 14.210595638811649 | 14.211 |
| 14.228969533118436 | 14.229 |
| 14.233717012914093 | 14.234 |
| 14.245013950604527 | 14.245 |
| 14.250302088727775 | 14.25 |
| 14.280427391937835 | 14.28 |
| 14.28281547241598 | 14.283 |
| 14.32093460453874 | 14.321 |
| 14.323684789786485 | 14.324 |
| 14.329829372333943 | 14.33 |
| 14.39461084511747 | 14.395 |
| 14.450659264399722 | 14.451 |
| 14.451529956286963 | 14.452 |
| 14.459164897381457 | 14.459 |
| 14.459835547122074 | 14.46 |
| 14.489119170984456 | 14.489 |
| 14.552587646076795 | 14.553 |
| 14.554356579159284 | 14.554 |
| 14.614781769954183 | 14.615 |
| 14.618705035971223 | 14.619 |
| 14.621612903225806 | 14.622 |
| 14.624563534234097 | 14.625 |
| 14.660403426360872 | 14.66 |
| 14.667069590744259 | 14.667 |
| 14.68862512363996 | 14.689 |
| 14.699524048096192 | 14.7 |
| 14.713801862828111 | 14.714 |
| 14.750600617778286 | 14.751 |
| 14.761556309120115 | 14.762 |
| 14.764550264550264 | 14.765 |
| 14.773569794050344 | 14.774 |
| 14.777994973471097 | 14.778 |
| 14.795913978494625 | 14.796 |
| 14.801376146788991 | 14.801 |
| 14.805968374747355 | 14.806 |
| 14.81968512855363 | 14.82 |
| 14.824644549763033 | 14.825 |
| 14.831725775337587 | 14.832 |
| 14.83780487804878 | 14.838 |
| 14.838118298166725 | 14.838 |
| 14.88041971886755 | 14.88 |
| 14.896232650363515 | 14.896 |
| 14.919483630556295 | 14.919 |
| 14.92159559834938 | 14.922 |
| 15.016575038975958 | 15.017 |
| 15.0571791613723 | 15.057 |
| 15.058898036732108 | 15.059 |
| 15.091601866251944 | 15.092 |
| 15.13167962483031 | 15.132 |
| 15.149113924050633 | 15.149 |
| 15.167677533484964 | 15.168 |
| 15.290634187316254 | 15.291 |
| 15.297445255474452 | 15.297 |
| 15.311975591151793 | 15.312 |
| 15.312311836475994 | 15.312 |
| 15.327064984527494 | 15.327 |
| 15.38159763960223 | 15.382 |
| 15.426571386903893 | 15.427 |
| 15.4640522875817 | 15.464 |
| 15.48930535750662 | 15.489 |
| 15.554359851151563 | 15.554 |
| 15.558252427184467 | 15.558 |
| 15.582707423580786 | 15.583 |
| 15.591331692644244 | 15.591 |
| 15.616649178034278 | 15.617 |
| 15.647215973003375 | 15.647 |
| 15.718236737776099 | 15.718 |
| 15.754168448054724 | 15.754 |
| 15.755155838114437 | 15.755 |
| 15.761918247899557 | 15.762 |
| 15.820408825438028 | 15.82 |
| 15.970218706375059 | 15.97 |
| 16.108808789514264 | 16.109 |
| 16.28157156220767 | 16.282 |
| 16.285579196217494 | 16.286 |
| 16.337912087912088 | 16.338 |
| 16.398961549256246 | 16.399 |
| 16.42471328153903 | 16.425 |
| 16.429757949691506 | 16.43 |
| 16.593217872216563 | 16.593 |
| 16.61701676214725 | 16.617 |
| 16.665033953022377 | 16.665 |
| 16.68974308687978 | 16.69 |
| 16.7286293827876 | 16.729 |
| 16.81808010740658 | 16.818 |
| 16.822931554708592 | 16.823 |
| 16.97429718875502 | 16.974 |
| 17.022020173320072 | 17.022 |
| 17.091181451087664 | 17.091 |
| 17.092094798791155 | 17.092 |
| 17.11639501438159 | 17.116 |
| 17.23224541252276 | 17.232 |
| 17.320543740407807 | 17.321 |
| 17.38529886914378 | 17.385 |
| 17.39446509706733 | 17.394 |
| 17.398096952552397 | 17.398 |
| 17.48545742993125 | 17.485 |
| 17.502958579881657 | 17.503 |
| 17.506497779240007 | 17.506 |
| 17.55495650042887 | 17.555 |
| 17.604607779125082 | 17.605 |
| 17.60476739715494 | 17.605 |
| 17.674705615942027 | 17.675 |
| 17.72870735669529 | 17.729 |
| 17.825906735751296 | 17.826 |
| 17.961306964746345 | 17.961 |
| 17.975908173562058 | 17.976 |
| 17.989201349831273 | 17.989 |
| 18.000235793444944 | 18 |
| 18.02950064757519 | 18.03 |
| 18.14677177177177 | 18.147 |
| 18.218712029161605 | 18.219 |
| 18.246835443037973 | 18.247 |
| 18.24834974569852 | 18.248 |
| 18.31846217105263 | 18.318 |
| 18.351435221101628 | 18.351 |
| 18.38908304210351 | 18.389 |
| 18.391118916206725 | 18.391 |
| 18.393613387978142 | 18.394 |
| 18.423529411764704 | 18.424 |
| 18.482726793248943 | 18.483 |
| 18.501602340810923 | 18.502 |
| 18.50950950950951 | 18.51 |
| 18.606143079315707 | 18.606 |
| 18.84378308434302 | 18.844 |
| 18.93027888446215 | 18.93 |
| 18.951687212053294 | 18.952 |
| 18.96381182147165 | 18.964 |
| 19.052446607191133 | 19.052 |
| 19.087794266179785 | 19.088 |
| 19.117254408060454 | 19.117 |
| 19.161434026304626 | 19.161 |
| 19.1990352881442 | 19.199 |
| 19.217791411042946 | 19.218 |
| 19.297404226575317 | 19.297 |
| 19.440845266231058 | 19.441 |
| 19.474151977484816 | 19.474 |
| 19.497813513894766 | 19.498 |
| 19.543997232153153 | 19.544 |
| 19.549073142692915 | 19.549 |
| 19.559613643223663 | 19.56 |
| 19.575315195753152 | 19.575 |
| 19.57923799006074 | 19.579 |
| 19.86215787385958 | 19.862 |
| 19.9185721335746 | 19.919 |
| 20.00494132180358 | 20.005 |
| 20.05511554735814 | 20.055 |
| 20.08550079034344 | 20.086 |
| 20.0972553699284 | 20.097 |
| 20.10707226004832 | 20.107 |
| 20.136758070114542 | 20.137 |
| 20.157049375371802 | 20.157 |
| 20.173432371739505 | 20.173 |
| 20.18368994751716 | 20.184 |
| 20.215473608098335 | 20.215 |
| 20.284066969730567 | 20.284 |
| 20.315514071559893 | 20.316 |
| 20.31784874879027 | 20.318 |
| 20.339866369710467 | 20.34 |
| 20.37638427464009 | 20.376 |
| 20.48996469994957 | 20.49 |
| 20.496002610540057 | 20.496 |
| 20.618518518518517 | 20.619 |
| 20.63401549771508 | 20.634 |
| 20.660186625194402 | 20.66 |
| 20.721397379912663 | 20.721 |
| 20.84321045263649 | 20.843 |
| 20.85645751799015 | 20.856 |
| 20.872612321764866 | 20.873 |
| 20.90611233480176 | 20.906 |
| 20.93498753927836 | 20.935 |
| 20.95003265839321 | 20.95 |
| 21.054342917356617 | 21.054 |
| 21.23844231570179 | 21.238 |
| 21.426713155424434 | 21.427 |
| 21.432450023245003 | 21.432 |
| 21.47502816372512 | 21.475 |
| 21.526297335203367 | 21.526 |
| 21.610681658468025 | 21.611 |
| 21.725613593455 | 21.726 |
| 21.77681048502822 | 21.777 |
| 22.211279117286473 | 22.211 |
| 22.255567668587446 | 22.256 |
| 22.29472608862214 | 22.295 |
| 22.438968915845336 | 22.439 |
| 22.46042576419214 | 22.46 |
| 22.477283673141756 | 22.477 |
| 22.492249811888637 | 22.492 |
| 22.55169718624386 | 22.552 |
| 22.55489328975197 | 22.555 |
| 22.627271091923006 | 22.627 |
| 22.627916724884727 | 22.628 |
| 22.64551775515272 | 22.646 |
| 22.65213946117274 | 22.652 |
| 22.676089371682508 | 22.676 |
| 22.718918226095873 | 22.719 |
| 22.79020349360706 | 22.79 |
| 22.865442547697604 | 22.865 |
| 22.995449182538344 | 22.995 |
| 23.067039106145252 | 23.067 |
| 23.15247732030705 | 23.152 |
| 23.301244682527177 | 23.301 |
| 23.42014341590613 | 23.42 |
| 23.466520307354557 | 23.467 |
| 23.506913842881023 | 23.507 |
| 23.638294838893643 | 23.638 |
| 23.66967411796391 | 23.67 |
| 23.795287958115182 | 23.795 |
| 23.83659738075213 | 23.837 |
| 23.936204360037447 | 23.936 |
| 23.956147687895808 | 23.956 |
| 23.968599033816425 | 23.969 |
| 24.06382108277649 | 24.064 |
| 24.277820532553488 | 24.278 |
| 24.389986956957962 | 24.39 |
| 24.417177060133632 | 24.417 |
| 24.42500511561285 | 24.425 |
| 24.54456633527597 | 24.545 |
| 24.566584463625155 | 24.567 |
| 24.602456188767768 | 24.602 |
| 24.60432931156849 | 24.604 |
| 24.685673809102177 | 24.686 |
| 24.820985332831892 | 24.821 |
| 24.94403339024853 | 24.944 |
| 24.99156524882516 | 24.992 |
| 25.00947352073303 | 25.009 |
| 25.027062925452434 | 25.027 |
| 25.028434600419036 | 25.028 |
| 25.034863349684652 | 25.035 |
| 25.036517674554485 | 25.037 |
| 25.197727009161543 | 25.198 |
| 25.228915662650603 | 25.229 |
| 25.36171839168323 | 25.362 |
| 25.438666425077006 | 25.439 |
| 25.455696202531644 | 25.456 |
| 25.902344546381244 | 25.902 |
| 26.0985503560529 | 26.099 |
| 26.324378213873437 | 26.324 |
| 26.343561368209254 | 26.344 |
| 26.34661259541985 | 26.347 |
| 26.533676935691695 | 26.534 |
| 26.57512787723785 | 26.575 |
| 26.674524982406755 | 26.675 |
| 27.236788321167882 | 27.237 |
| 27.352896558263012 | 27.353 |
| 27.471804246941357 | 27.472 |
| 27.577984702361157 | 27.578 |
| 27.674218847255073 | 27.674 |
| 28.11560115100713 | 28.116 |
| 28.625365283459963 | 28.625 |
| 28.838917817523207 | 28.839 |
| 28.96266318537859 | 28.963 |
| 29.3391880218831 | 29.339 |
| 29.75640224859463 | 29.756 |
| 30.819786413527144 | 30.82 |
| 31.193562005277045 | 31.194 |
| 31.310109483861794 | 31.31 |
| 31.342824226464778 | 31.343 |
| 31.356997282608695 | 31.357 |
| 31.510692113129455 | 31.511 |
| 31.895063597819505 | 31.895 |
| 31.962593063373888 | 31.963 |
| 32.169991801038535 | 32.17 |
| 32.234612199834395 | 32.235 |
| 32.268398268398265 | 32.268 |
| 32.27253605769231 | 32.273 |
| 32.88120567375886 | 32.881 |
| 33.03521804925024 | 33.035 |
| 33.08348490360131 | 33.083 |
| 33.46871476888388 | 33.469 |
| 33.68429003021148 | 33.684 |
| 33.764799364322606 | 33.765 |
| 34.922854534388314 | 34.923 |
| 35.007751937984494 | 35.008 |
| 35.57427220701667 | 35.574 |
| 35.67300202523758 | 35.673 |
| 35.817385766597674 | 35.817 |
| 36.247225501770956 | 36.247 |
| 36.850438492533776 | 36.85 |
| 37.47610121836926 | 37.476 |
| 37.54505465209277 | 37.545 |
| 37.849900199600796 | 37.85 |
| 38.0414757656137 | 38.041 |
| 38.47934581015006 | 38.479 |
| 38.66510172143975 | 38.665 |
| 39.18532501641497 | 39.185 |
| 39.38066465256797 | 39.381 |
| 39.38504115810389 | 39.385 |
| 39.427155599603566 | 39.427 |
| 40.043683961520266 | 40.044 |
| 40.05172161172161 | 40.052 |
| 40.40536839222131 | 40.405 |
| 40.63766792748142 | 40.638 |
| 41.88271068635969 | 41.883 |
| 42.27230537185288 | 42.272 |
| 42.737208907020225 | 42.737 |
| 43.71162175168431 | 43.712 |
| 44.12263413108087 | 44.123 |
| 52.202980662643185 | 52.203 |
| 53.311397984886646 | 53.311 |
| 55.17064899028827 | 55.171 |
| 57.06281227694504 | 57.063 |
| 58.78549669994923 | 58.785 |
| 59.2350166481687 | 59.235 |
| 69.07489557828028 | 69.075 |
| 132.29715061058346 | 132.297 |